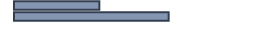
| Category | Percentatge |
|---|---|
| 0 | 35.561 |
| 1 | 64.439 |